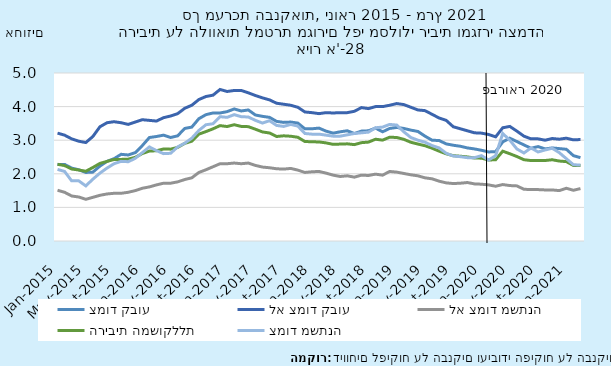
| Category | צמוד קבוע | לא צמוד קבוע | לא צמוד משתנה | הריבית המשוקללת | צמוד משתנה |
|---|---|---|---|---|---|
| 2015-01-31 | 2.28 | 3.21 | 1.51 | 2.284 | 2.13 |
| 2015-02-28 | 2.28 | 3.15 | 1.45 | 2.245 | 2.07 |
| 2015-03-31 | 2.17 | 3.04 | 1.34 | 2.142 | 1.79 |
| 2015-04-30 | 2.12 | 2.97 | 1.31 | 2.113 | 1.79 |
| 2015-05-31 | 2.04 | 2.93 | 1.24 | 2.076 | 1.64 |
| 2015-06-30 | 2.05 | 3.11 | 1.3 | 2.188 | 1.84 |
| 2015-07-31 | 2.23 | 3.4 | 1.36 | 2.31 | 2.02 |
| 2015-08-31 | 2.37 | 3.52 | 1.4 | 2.369 | 2.17 |
| 2015-09-30 | 2.45 | 3.55 | 1.42 | 2.427 | 2.3 |
| 2015-10-31 | 2.58 | 3.52 | 1.42 | 2.429 | 2.37 |
| 2015-11-30 | 2.56 | 3.47 | 1.45 | 2.436 | 2.36 |
| 2015-12-31 | 2.63 | 3.54 | 1.5 | 2.491 | 2.46 |
| 2016-01-31 | 2.84 | 3.61 | 1.57 | 2.603 | 2.63 |
| 2016-02-29 | 3.08 | 3.59 | 1.61 | 2.676 | 2.8 |
| 2016-03-31 | 3.11 | 3.57 | 1.67 | 2.686 | 2.69 |
| 2016-04-30 | 3.15 | 3.67 | 1.72 | 2.738 | 2.6 |
| 2016-05-31 | 3.08 | 3.72 | 1.72 | 2.734 | 2.61 |
| 2016-06-30 | 3.13 | 3.79 | 1.76 | 2.786 | 2.8 |
| 2016-07-31 | 3.35 | 3.95 | 1.83 | 2.906 | 2.91 |
| 2016-08-31 | 3.39 | 4.04 | 1.88 | 2.97 | 3.06 |
| 2016-09-30 | 3.64 | 4.21 | 2.04 | 3.18 | 3.29 |
| 2016-10-31 | 3.76 | 4.3 | 2.12 | 3.256 | 3.46 |
| 2016-11-30 | 3.81 | 4.34 | 2.21 | 3.338 | 3.49 |
| 2016-12-31 | 3.81 | 4.51 | 2.3 | 3.434 | 3.7 |
| 2017-01-31 | 3.85 | 4.45 | 2.3 | 3.407 | 3.68 |
| 2017-02-28 | 3.93 | 4.48 | 2.32 | 3.461 | 3.76 |
| 2017-03-31 | 3.87 | 4.48 | 2.3 | 3.41 | 3.7 |
| 2017-04-30 | 3.9 | 4.41 | 2.32 | 3.403 | 3.69 |
| 2017-05-31 | 3.75 | 4.33 | 2.25 | 3.327 | 3.59 |
| 2017-06-30 | 3.71 | 4.26 | 2.2 | 3.246 | 3.51 |
| 2017-07-31 | 3.68 | 4.2 | 2.18 | 3.214 | 3.58 |
| 2017-08-31 | 3.56 | 4.1 | 2.15 | 3.11 | 3.44 |
| 2017-09-30 | 3.53 | 4.07 | 2.14 | 3.13 | 3.41 |
| 2017-10-31 | 3.54 | 4.04 | 2.16 | 3.118 | 3.47 |
| 2017-11-30 | 3.51 | 3.98 | 2.11 | 3.088 | 3.42 |
| 2017-12-31 | 3.34 | 3.84 | 2.04 | 2.962 | 3.2 |
| 2018-01-31 | 3.34 | 3.82 | 2.06 | 2.952 | 3.18 |
| 2018-02-28 | 3.36 | 3.79 | 2.07 | 2.948 | 3.18 |
| 2018-03-31 | 3.27 | 3.82 | 2.02 | 2.92 | 3.15 |
| 2018-04-30 | 3.21 | 3.81 | 1.96 | 2.876 | 3.12 |
| 2018-05-31 | 3.25 | 3.82 | 1.92 | 2.885 | 3.12 |
| 2018-06-30 | 3.28 | 3.82 | 1.94 | 2.892 | 3.16 |
| 2018-07-31 | 3.2 | 3.86 | 1.9 | 2.868 | 3.2 |
| 2018-08-31 | 3.27 | 3.97 | 1.96 | 2.927 | 3.22 |
| 2018-09-30 | 3.28 | 3.94 | 1.95 | 2.944 | 3.24 |
| 2018-10-31 | 3.36 | 4 | 1.99 | 3.029 | 3.37 |
| 2018-11-30 | 3.25 | 4 | 1.96 | 3.003 | 3.39 |
| 2018-12-31 | 3.35 | 4.04 | 2.07 | 3.089 | 3.47 |
| 2019-01-31 | 3.38 | 4.09 | 2.05 | 3.081 | 3.45 |
| 2019-02-28 | 3.35 | 4.06 | 2.01 | 3.026 | 3.25 |
| 2019-03-31 | 3.3 | 3.98 | 1.97 | 2.938 | 3.08 |
| 2019-04-30 | 3.26 | 3.9 | 1.94 | 2.886 | 3 |
| 2019-05-31 | 3.12 | 3.88 | 1.88 | 2.835 | 2.94 |
| 2019-06-30 | 3 | 3.77 | 1.85 | 2.762 | 2.84 |
| 2019-07-31 | 2.99 | 3.66 | 1.78 | 2.673 | 2.77 |
| 2019-08-31 | 2.89 | 3.59 | 1.73 | 2.595 | 2.61 |
| 2019-09-30 | 2.85 | 3.4 | 1.71 | 2.539 | 2.53 |
| 2019-10-31 | 2.82 | 3.34 | 1.72 | 2.523 | 2.51 |
| 2019-11-30 | 2.77 | 3.28 | 1.74 | 2.503 | 2.48 |
| 2019-12-31 | 2.74 | 3.22 | 1.7 | 2.47 | 2.48 |
| 2020-01-31 | 2.7 | 3.21 | 1.69 | 2.465 | 2.54 |
| 2020-02-29 | 2.65 | 3.17 | 1.67 | 2.41 | 2.41 |
| 2020-03-31 | 2.66 | 3.1 | 1.63 | 2.42 | 2.54 |
| 2020-04-30 | 2.95 | 3.37 | 1.68 | 2.673 | 3.2 |
| 2020-05-31 | 3.06 | 3.41 | 1.65 | 2.597 | 3 |
| 2020-06-30 | 2.96 | 3.27 | 1.64 | 2.514 | 2.74 |
| 2020-07-31 | 2.86 | 3.12 | 1.54 | 2.419 | 2.62 |
| 2020-08-31 | 2.76 | 3.04 | 1.53 | 2.394 | 2.77 |
| 2020-09-30 | 2.81 | 3.04 | 1.53 | 2.394 | 2.65 |
| 2020-10-31 | 2.74 | 3 | 1.52 | 2.396 | 2.71 |
| 2020-11-30 | 2.77 | 3.05 | 1.52 | 2.418 | 2.76 |
| 2020-12-31 | 2.75 | 3.03 | 1.5 | 2.379 | 2.63 |
| 2021-01-31 | 2.73 | 3.06 | 1.57 | 2.363 | 2.45 |
| 2021-02-28 | 2.54 | 3.01 | 1.51 | 2.248 | 2.27 |
| 2021-03-31 | 2.48 | 3.02 | 1.56 | 2.247 | 2.26 |